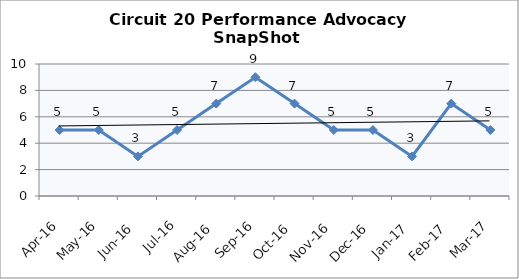
| Category | Circuit 20 |
|---|---|
| Apr-16 | 5 |
| May-16 | 5 |
| Jun-16 | 3 |
| Jul-16 | 5 |
| Aug-16 | 7 |
| Sep-16 | 9 |
| Oct-16 | 7 |
| Nov-16 | 5 |
| Dec-16 | 5 |
| Jan-17 | 3 |
| Feb-17 | 7 |
| Mar-17 | 5 |